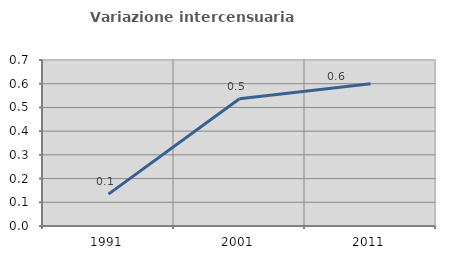
| Category | Variazione intercensuaria annua |
|---|---|
| 1991.0 | 0.134 |
| 2001.0 | 0.537 |
| 2011.0 | 0.6 |